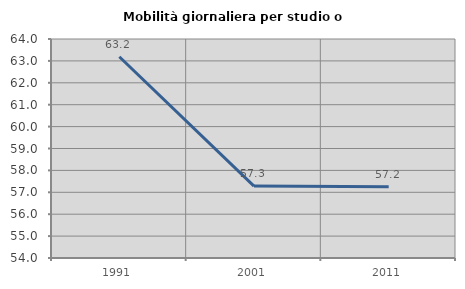
| Category | Mobilità giornaliera per studio o lavoro |
|---|---|
| 1991.0 | 63.191 |
| 2001.0 | 57.285 |
| 2011.0 | 57.248 |